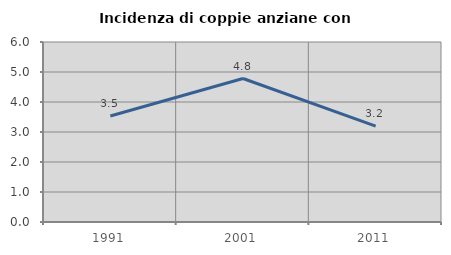
| Category | Incidenza di coppie anziane con figli |
|---|---|
| 1991.0 | 3.533 |
| 2001.0 | 4.782 |
| 2011.0 | 3.193 |